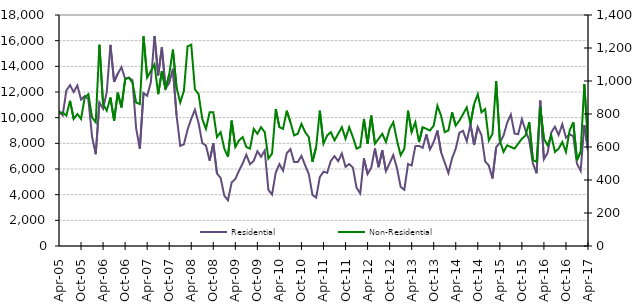
| Category | Residential |
|---|---|
| 2005-04-01 | 10540 |
| 2005-05-01 | 10180 |
| 2005-06-01 | 12120 |
| 2005-07-01 | 12530 |
| 2005-08-01 | 12000 |
| 2005-09-01 | 12510 |
| 2005-10-01 | 11410 |
| 2005-11-01 | 11690 |
| 2005-12-01 | 11430 |
| 2006-01-01 | 8500 |
| 2006-02-01 | 7150 |
| 2006-03-01 | 11180 |
| 2006-04-01 | 10690 |
| 2006-05-01 | 11990 |
| 2006-06-01 | 15670 |
| 2006-07-01 | 12790 |
| 2006-08-01 | 13430 |
| 2006-09-01 | 13930 |
| 2006-10-01 | 13030 |
| 2006-11-01 | 13120 |
| 2006-12-01 | 12920 |
| 2007-01-01 | 9170 |
| 2007-02-01 | 7580 |
| 2007-03-01 | 11920 |
| 2007-04-01 | 11700 |
| 2007-05-01 | 12750 |
| 2007-06-01 | 16360 |
| 2007-07-01 | 13290 |
| 2007-08-01 | 15480 |
| 2007-09-01 | 12270 |
| 2007-10-01 | 12700 |
| 2007-11-01 | 13810 |
| 2007-12-01 | 10180 |
| 2008-01-01 | 7800 |
| 2008-02-01 | 7920 |
| 2008-03-01 | 9080 |
| 2008-04-01 | 9910 |
| 2008-05-01 | 10620 |
| 2008-06-01 | 9580 |
| 2008-07-01 | 8020 |
| 2008-08-01 | 7830 |
| 2008-09-01 | 6650 |
| 2008-10-01 | 8000 |
| 2008-11-01 | 5650 |
| 2008-12-01 | 5300 |
| 2009-01-01 | 3920 |
| 2009-02-01 | 3560 |
| 2009-03-01 | 4950 |
| 2009-04-01 | 5220 |
| 2009-05-01 | 5870 |
| 2009-06-01 | 6440 |
| 2009-07-01 | 7110 |
| 2009-08-01 | 6370 |
| 2009-09-01 | 6630 |
| 2009-10-01 | 7380 |
| 2009-11-01 | 6950 |
| 2009-12-01 | 7440 |
| 2010-01-01 | 4370 |
| 2010-02-01 | 4010 |
| 2010-03-01 | 5720 |
| 2010-04-01 | 6380 |
| 2010-05-01 | 5870 |
| 2010-06-01 | 7230 |
| 2010-07-01 | 7550 |
| 2010-08-01 | 6540 |
| 2010-09-01 | 6540 |
| 2010-10-01 | 7020 |
| 2010-11-01 | 6290 |
| 2010-12-01 | 5600 |
| 2011-01-01 | 3980 |
| 2011-02-01 | 3770 |
| 2011-03-01 | 5370 |
| 2011-04-01 | 5790 |
| 2011-05-01 | 5700 |
| 2011-06-01 | 6640 |
| 2011-07-01 | 7000 |
| 2011-08-01 | 6610 |
| 2011-09-01 | 7210 |
| 2011-10-01 | 6170 |
| 2011-11-01 | 6390 |
| 2011-12-01 | 6110 |
| 2012-01-01 | 4540 |
| 2012-02-01 | 4100 |
| 2012-03-01 | 6830 |
| 2012-04-01 | 5610 |
| 2012-05-01 | 6110 |
| 2012-06-01 | 7600 |
| 2012-07-01 | 6140 |
| 2012-08-01 | 7460 |
| 2012-09-01 | 5830 |
| 2012-10-01 | 6450 |
| 2012-11-01 | 7090 |
| 2012-12-01 | 6070 |
| 2013-01-01 | 4610 |
| 2013-02-01 | 4380 |
| 2013-03-01 | 6390 |
| 2013-04-01 | 6270 |
| 2013-05-01 | 7780 |
| 2013-06-01 | 7800 |
| 2013-07-01 | 7650 |
| 2013-08-01 | 8700 |
| 2013-09-01 | 7520 |
| 2013-10-01 | 8110 |
| 2013-11-01 | 9000 |
| 2013-12-01 | 7310 |
| 2014-01-01 | 6500 |
| 2014-02-01 | 5680 |
| 2014-03-01 | 6830 |
| 2014-04-01 | 7590 |
| 2014-05-01 | 8830 |
| 2014-06-01 | 8970 |
| 2014-07-01 | 8160 |
| 2014-08-01 | 9500 |
| 2014-09-01 | 7870 |
| 2014-10-01 | 9270 |
| 2014-11-01 | 8640 |
| 2014-12-01 | 6590 |
| 2015-01-01 | 6270 |
| 2015-02-01 | 5260 |
| 2015-03-01 | 7700 |
| 2015-04-01 | 8060 |
| 2015-05-01 | 8600 |
| 2015-06-01 | 9610 |
| 2015-07-01 | 10240 |
| 2015-08-01 | 8760 |
| 2015-09-01 | 8710 |
| 2015-10-01 | 9880 |
| 2015-11-01 | 9000 |
| 2015-12-01 | 8230 |
| 2016-01-01 | 6430 |
| 2016-02-01 | 5670 |
| 2016-03-01 | 11330 |
| 2016-04-01 | 6760 |
| 2016-05-01 | 7250 |
| 2016-06-01 | 8850 |
| 2016-07-01 | 9290 |
| 2016-08-01 | 8650 |
| 2016-09-01 | 9490 |
| 2016-10-01 | 8440 |
| 2016-11-01 | 8710 |
| 2016-12-01 | 8550 |
| 2017-01-01 | 6410 |
| 2017-02-01 | 5860 |
| 2017-03-01 | 9430 |
| 2017-04-01 | 7440 |